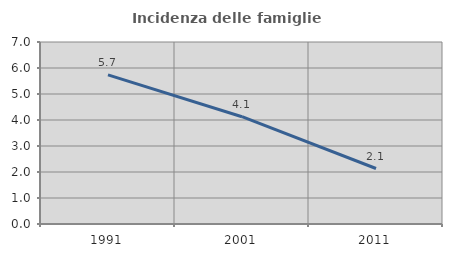
| Category | Incidenza delle famiglie numerose |
|---|---|
| 1991.0 | 5.735 |
| 2001.0 | 4.127 |
| 2011.0 | 2.134 |